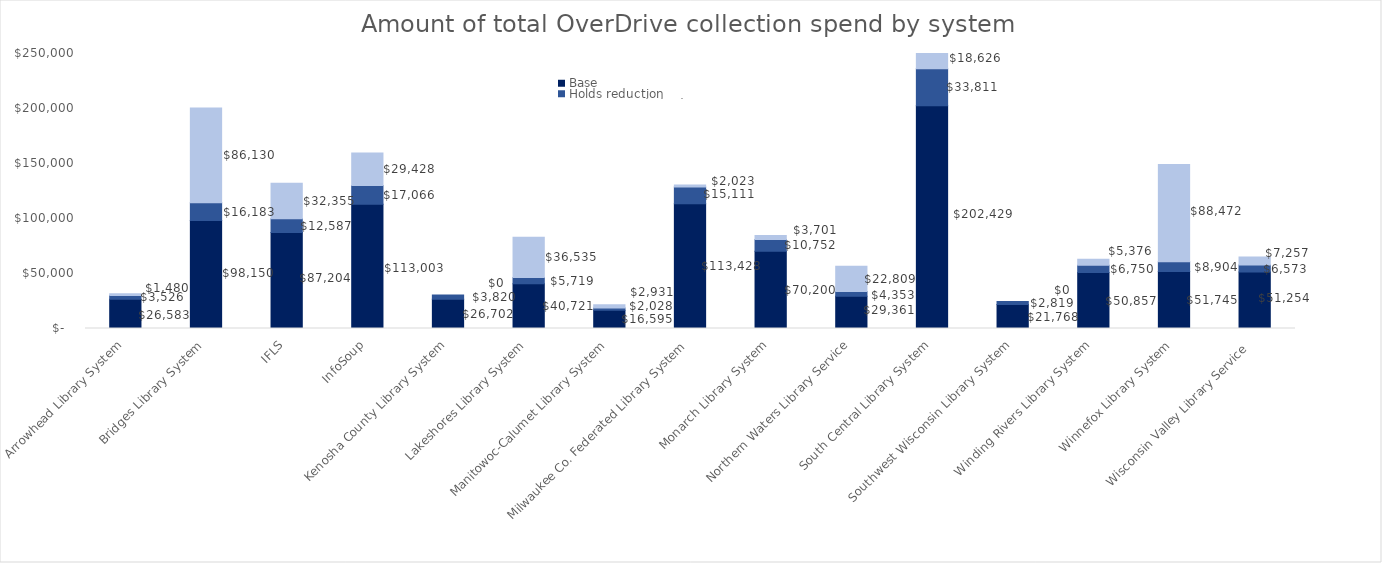
| Category | Base | Holds reduction | System-Funded Advantage |
|---|---|---|---|
| Arrowhead Library System | 26583.211 | 3525.521 | 1480.429 |
| Bridges Library System | 98149.815 | 16182.918 | 86129.902 |
| IFLS | 87204.35 | 12587.379 | 32355.231 |
| InfoSoup | 113003 | 17066 | 29428 |
| Kenosha County Library System | 26701.836 | 3819.538 | 0 |
| Lakeshores Library System | 40721.386 | 5719.203 | 36535.487 |
| Manitowoc-Calumet Library System | 16594.649 | 2027.537 | 2930.673 |
| Milwaukee Co. Federated Library System | 113427.754 | 15110.936 | 2022.984 |
| Monarch Library System | 70200.267 | 10751.562 | 3700.848 |
| Northern Waters Library Service | 29361.374 | 4352.578 | 22809.012 |
| South Central Library System | 202429.244 | 33810.793 | 18626.047 |
| Southwest Wisconsin Library System | 21768.451 | 2818.825 | 0 |
| Winding Rivers Library System | 50856.949 | 6750.23 | 5376.14 |
| Winnefox Library System | 51744.726 | 8903.672 | 88472.068 |
| Wisconsin Valley Library Service  | 51253.587 | 6573.265 | 7257.125 |